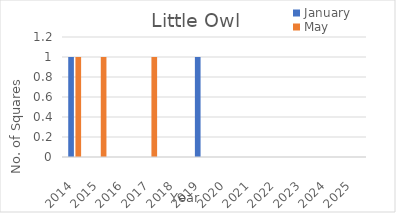
| Category | January | May |
|---|---|---|
| 2014.0 | 1 | 1 |
| 2015.0 | 0 | 1 |
| 2016.0 | 0 | 0 |
| 2017.0 | 0 | 1 |
| 2018.0 | 0 | 0 |
| 2019.0 | 1 | 0 |
| 2020.0 | 0 | 0 |
| 2021.0 | 0 | 0 |
| 2022.0 | 0 | 0 |
| 2023.0 | 0 | 0 |
| 2024.0 | 0 | 0 |
| 2025.0 | 0 | 0 |